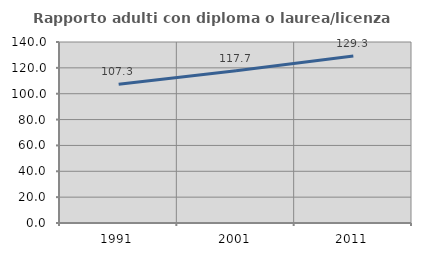
| Category | Rapporto adulti con diploma o laurea/licenza media  |
|---|---|
| 1991.0 | 107.35 |
| 2001.0 | 117.739 |
| 2011.0 | 129.252 |